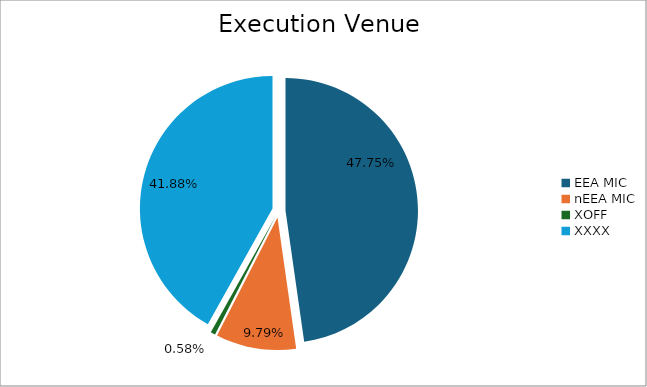
| Category | Series 0 |
|---|---|
| EEA MIC | 7112100.577 |
| nEEA MIC | 1458539.532 |
| XOFF | 85744.445 |
| XXXX | 6238760.745 |